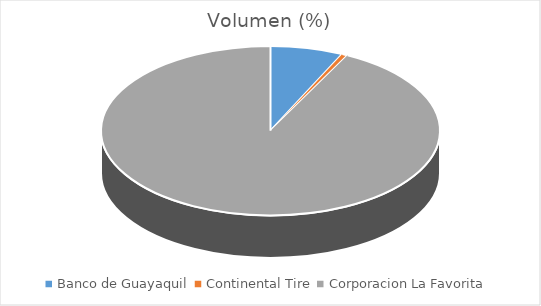
| Category | Volumen |
|---|---|
| Banco de Guayaquil | 50000 |
| Continental Tire | 4000 |
| Corporacion La Favorita | 664413.56 |